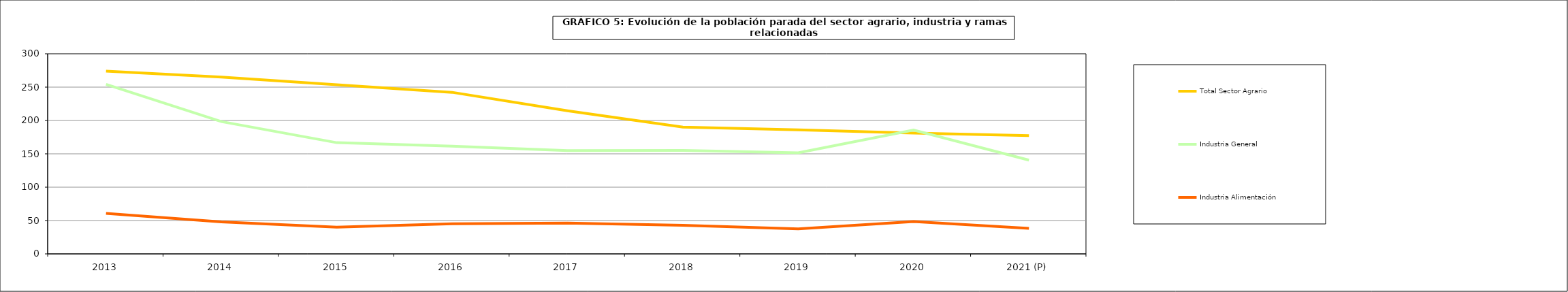
| Category | Total Sector Agrario | Industria General | Industria Alimentación |
|---|---|---|---|
| 2013 | 273.925 | 254.3 | 60.8 |
| 2014 | 265.1 | 198.3 | 47.85 |
| 2015 | 253.575 | 166.725 | 40.1 |
| 2016 | 242.2 | 161.6 | 45.23 |
| 2017 | 214.5 | 154.8 | 46.3 |
| 2018 | 190.1 | 154.975 | 42.9 |
| 2019 | 186.075 | 151.6 | 37.575 |
| 2020 | 181.2 | 185.6 | 48.45 |
| 2021 (P) | 177.2 | 140.6 | 38.375 |